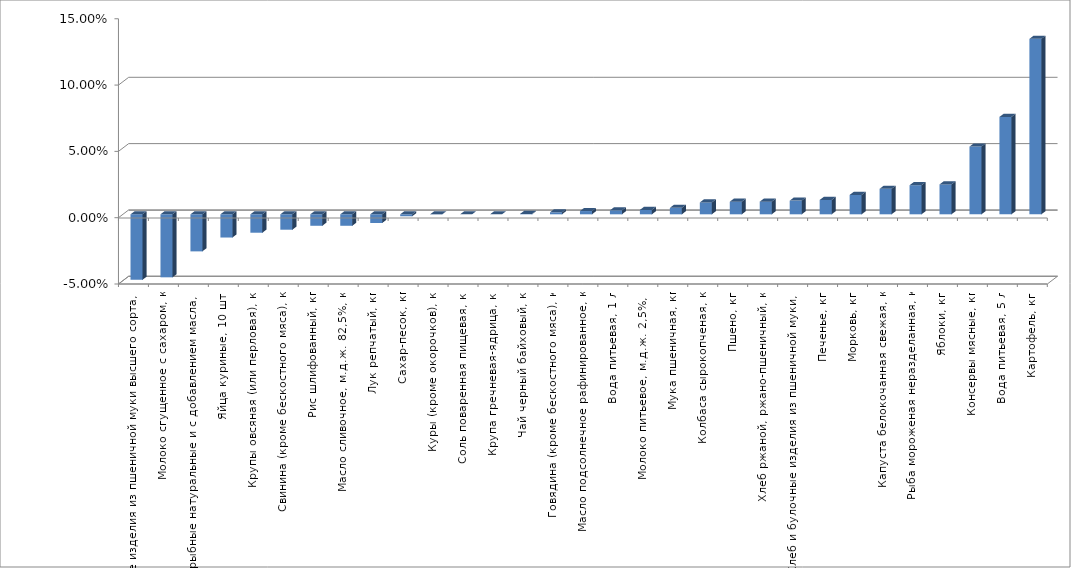
| Category | Series 0 |
|---|---|
| Макаронные изделия из пшеничной муки высшего сорта, кг | -0.049 |
| Молоко сгущенное с сахаром, кг | -0.048 |
| Консервы рыбные натуральные и с добавлением масла, кг | -0.028 |
| Яйца куриные, 10 шт. | -0.018 |
| Крупы овсяная (или перловая), кг | -0.014 |
| Свинина (кроме бескостного мяса), кг | -0.012 |
| Рис шлифованный, кг | -0.009 |
| Масло сливочное, м.д.ж. 82,5%, кг | -0.009 |
| Лук репчатый, кг | -0.007 |
| Сахар-песок, кг | -0.001 |
| Куры (кроме окорочков), кг | 0 |
| Соль поваренная пищевая, кг | 0 |
| Крупа гречневая-ядрица, кг | 0 |
| Чай черный байховый, кг | 0 |
| Говядина (кроме бескостного мяса), кг | 0.002 |
| Масло подсолнечное рафинированное, кг | 0.002 |
| Вода питьевая, 1 л | 0.003 |
| Молоко питьевое, м.д.ж. 2,5%, л | 0.003 |
| Мука пшеничная, кг | 0.005 |
| Колбаса сырокопченая, кг | 0.009 |
| Пшено, кг | 0.009 |
| Хлеб ржаной, ржано-пшеничный, кг | 0.01 |
| Хлеб и булочные изделия из пшеничной муки, кг | 0.01 |
| Печенье, кг | 0.011 |
| Морковь, кг | 0.015 |
| Капуста белокочанная свежая, кг | 0.019 |
| Рыба мороженая неразделанная, кг | 0.022 |
| Яблоки, кг | 0.023 |
| Консервы мясные, кг | 0.051 |
| Вода питьевая, 5 л | 0.073 |
| Картофель, кг | 0.132 |